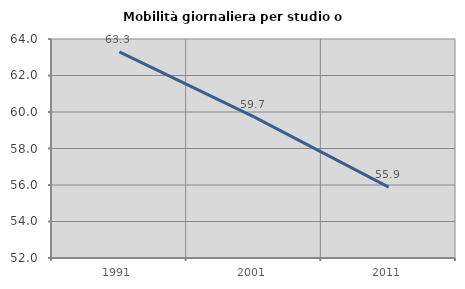
| Category | Mobilità giornaliera per studio o lavoro |
|---|---|
| 1991.0 | 63.291 |
| 2001.0 | 59.732 |
| 2011.0 | 55.881 |